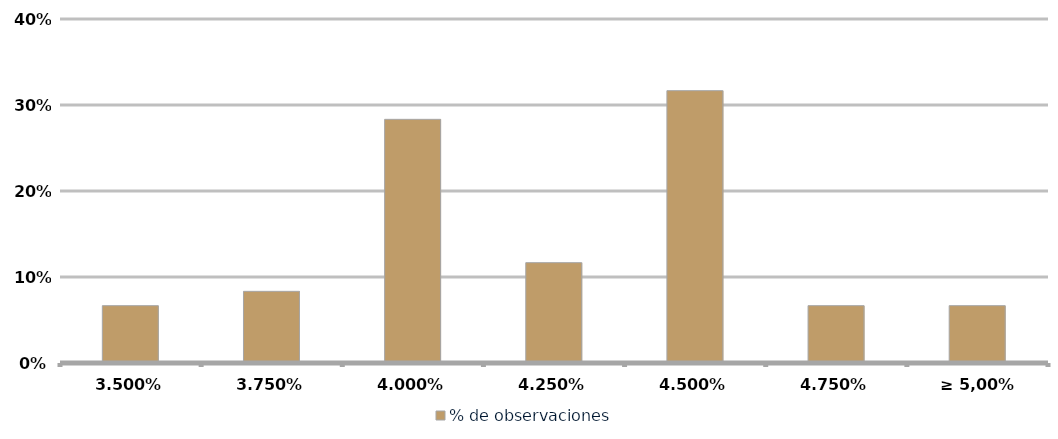
| Category | % de observaciones  |
|---|---|
| 3.50% | 0.067 |
| 3.75% | 0.083 |
| 4.00% | 0.283 |
| 4.25% | 0.117 |
| 4.50% | 0.317 |
| 4.75% | 0.067 |
| ≥ 5,00% | 0.067 |